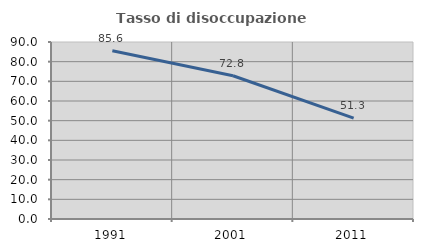
| Category | Tasso di disoccupazione giovanile  |
|---|---|
| 1991.0 | 85.561 |
| 2001.0 | 72.844 |
| 2011.0 | 51.282 |